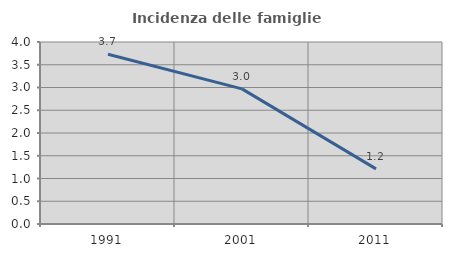
| Category | Incidenza delle famiglie numerose |
|---|---|
| 1991.0 | 3.731 |
| 2001.0 | 2.97 |
| 2011.0 | 1.212 |